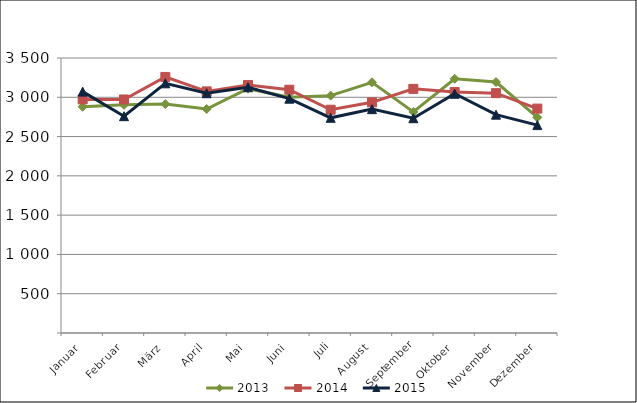
| Category | 2013 | 2014 | 2015 |
|---|---|---|---|
| Januar | 2879.307 | 2972.91 | 3072.064 |
| Februar | 2903.853 | 2971.852 | 2759.706 |
| März | 2913.349 | 3258.846 | 3177.937 |
| April | 2850.861 | 3075.389 | 3051.689 |
| Mai | 3109.389 | 3156.743 | 3128.043 |
| Juni | 2999.587 | 3096.493 | 2982.352 |
| Juli | 3021.085 | 2841.639 | 2738.818 |
| August | 3190.723 | 2935.673 | 2849.083 |
| September | 2813.093 | 3107.04 | 2733.484 |
| Oktober | 3236.046 | 3067.802 | 3044.904 |
| November | 3194.378 | 3052.711 | 2778.783 |
| Dezember | 2743.882 | 2855.924 | 2646.005 |